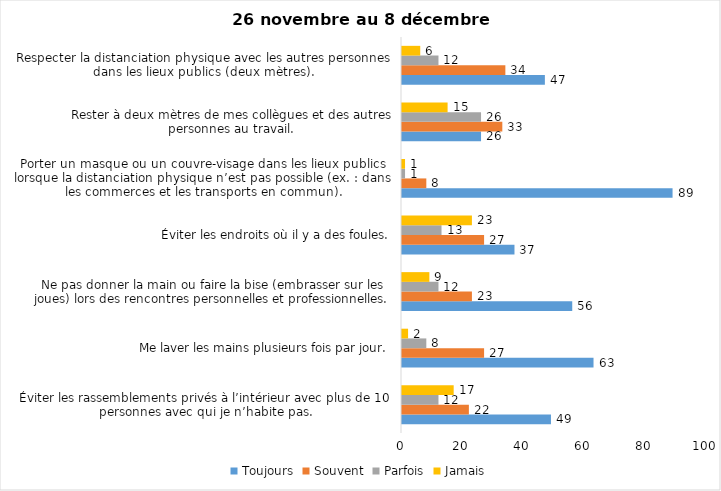
| Category | Toujours | Souvent | Parfois | Jamais |
|---|---|---|---|---|
| Éviter les rassemblements privés à l’intérieur avec plus de 10 personnes avec qui je n’habite pas. | 49 | 22 | 12 | 17 |
| Me laver les mains plusieurs fois par jour. | 63 | 27 | 8 | 2 |
| Ne pas donner la main ou faire la bise (embrasser sur les joues) lors des rencontres personnelles et professionnelles. | 56 | 23 | 12 | 9 |
| Éviter les endroits où il y a des foules. | 37 | 27 | 13 | 23 |
| Porter un masque ou un couvre-visage dans les lieux publics lorsque la distanciation physique n’est pas possible (ex. : dans les commerces et les transports en commun). | 89 | 8 | 1 | 1 |
| Rester à deux mètres de mes collègues et des autres personnes au travail. | 26 | 33 | 26 | 15 |
| Respecter la distanciation physique avec les autres personnes dans les lieux publics (deux mètres). | 47 | 34 | 12 | 6 |